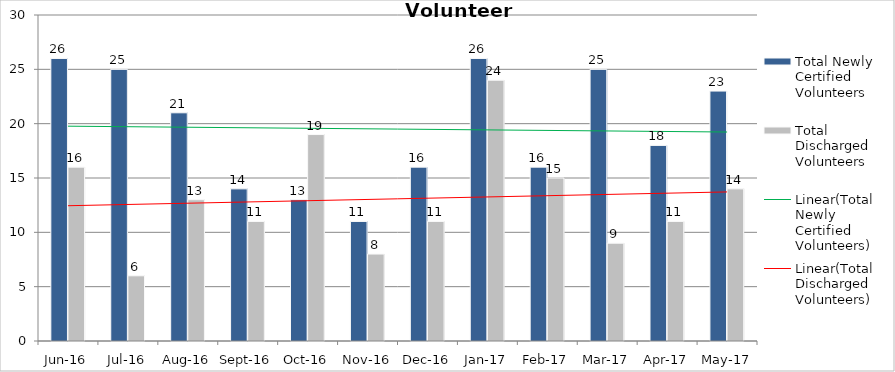
| Category | Total Newly Certified Volunteers | Total Discharged Volunteers |
|---|---|---|
| Jun-16 | 26 | 16 |
| Jul-16 | 25 | 6 |
| Aug-16 | 21 | 13 |
| Sep-16 | 14 | 11 |
| Oct-16 | 13 | 19 |
| Nov-16 | 11 | 8 |
| Dec-16 | 16 | 11 |
| Jan-17 | 26 | 24 |
| Feb-17 | 16 | 15 |
| Mar-17 | 25 | 9 |
| Apr-17 | 18 | 11 |
| May-17 | 23 | 14 |